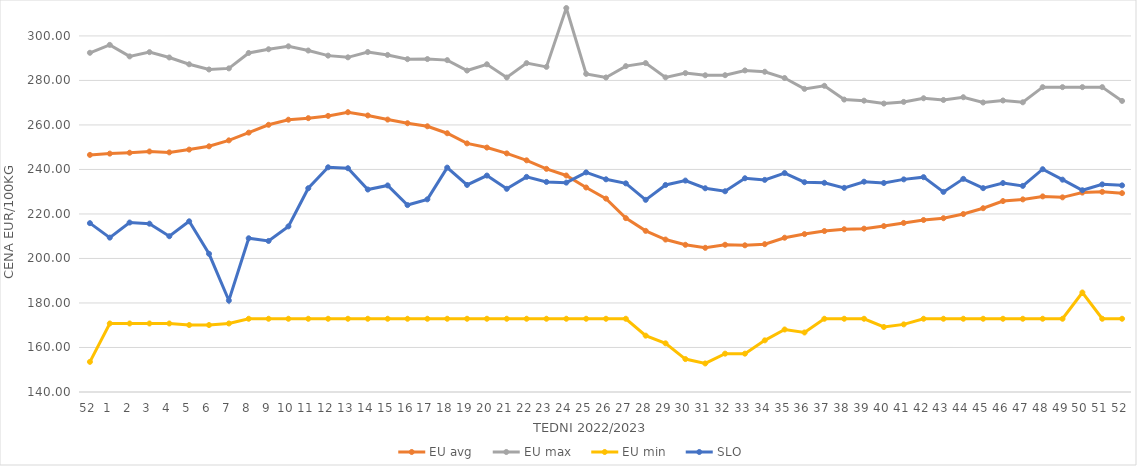
| Category | EU avg | EU max | EU min | SLO |
|---|---|---|---|---|
| 52.0 | 246.546 | 292.426 | 153.54 | 215.87 |
| 1.0 | 247.118 | 295.98 | 170.79 | 209.37 |
| 2.0 | 247.516 | 290.8 | 170.79 | 216.15 |
| 3.0 | 248.079 | 292.71 | 170.79 | 215.63 |
| 4.0 | 247.672 | 290.32 | 170.79 | 210 |
| 5.0 | 248.924 | 287.27 | 170.09 | 216.7 |
| 6.0 | 250.4 | 284.92 | 170.09 | 202.1 |
| 7.0 | 253.074 | 285.42 | 170.79 | 181.11 |
| 8.0 | 256.543 | 292.35 | 172.91 | 209.08 |
| 9.0 | 260.066 | 294.02 | 172.91 | 207.87 |
| 10.0 | 262.352 | 295.33 | 172.91 | 214.42 |
| 11.0 | 263.049 | 293.44 | 172.91 | 231.56 |
| 12.0 | 264.068 | 291.15 | 172.91 | 240.97 |
| 13.0 | 265.73 | 290.38 | 172.91 | 240.55 |
| 14.0 | 264.262 | 292.763 | 172.91 | 230.99 |
| 15.0 | 262.411 | 291.46 | 172.91 | 232.82 |
| 16.0 | 260.77 | 289.56 | 172.91 | 224 |
| 17.0 | 259.395 | 289.61 | 172.91 | 226.57 |
| 18.0 | 256.275 | 289.13 | 172.91 | 240.83 |
| 19.0 | 251.716 | 284.45 | 172.91 | 233.05 |
| 20.0 | 249.836 | 287.26 | 172.91 | 237.25 |
| 21.0 | 247.212 | 281.33 | 172.91 | 231.3 |
| 22.0 | 244.103 | 287.77 | 172.91 | 236.67 |
| 23.0 | 240.279 | 286.1 | 172.91 | 234.39 |
| 24.0 | 237.289 | 312.54 | 172.91 | 234.08 |
| 25.0 | 231.895 | 282.95 | 172.91 | 238.69 |
| 26.0 | 226.903 | 281.34 | 172.91 | 235.57 |
| 27.0 | 218.126 | 286.43 | 172.91 | 233.75 |
| 28.0 | 212.406 | 287.8 | 165.32 | 226.35 |
| 29.0 | 208.504 | 281.37 | 161.87 | 233.03 |
| 30.0 | 206.149 | 283.3 | 154.8 | 235 |
| 31.0 | 204.79 | 282.32 | 152.83 | 231.55 |
| 32.0 | 206.16 | 282.36 | 157.23 | 230.2 |
| 33.0 | 205.917 | 284.5 | 157.23 | 236.04 |
| 34.0 | 206.436 | 283.9 | 163.21 | 235.32 |
| 35.0 | 209.326 | 281.09 | 168.085 | 238.39 |
| 36.0 | 210.957 | 276.21 | 166.745 | 234.27 |
| 37.0 | 212.325 | 277.59 | 172.91 | 234 |
| 38.0 | 213.132 | 271.4 | 172.91 | 231.74 |
| 39.0 | 213.398 | 270.91 | 172.91 | 234.5 |
| 40.0 | 214.548 | 269.62 | 169.209 | 233.92 |
| 41.0 | 215.966 | 270.36 | 170.387 | 235.54 |
| 42.0 | 217.294 | 271.99 | 172.91 | 236.54 |
| 43.0 | 218.091 | 271.22 | 172.91 | 229.92 |
| 44.0 | 219.965 | 272.45 | 172.91 | 235.77 |
| 45.0 | 222.584 | 270.09 | 172.91 | 231.6 |
| 46.0 | 225.795 | 270.99 | 172.91 | 233.89 |
| 47.0 | 226.547 | 270.18 | 172.91 | 232.62 |
| 48.0 | 227.89 | 276.99 | 172.91 | 240.11 |
| 49.0 | 227.466 | 276.99 | 172.91 | 235.41 |
| 50.0 | 229.613 | 276.99 | 184.72 | 230.65 |
| 51.0 | 229.933 | 276.99 | 172.91 | 233.3 |
| 52.0 | 229.362 | 270.79 | 172.91 | 232.85 |